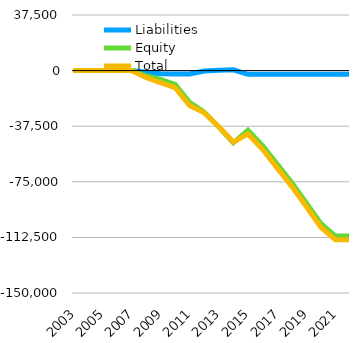
| Category | Liabilities  | Equity  | Total |
|---|---|---|---|
| 2003 | 0 | 0 | 0 |
| 2004 | 0 | 0 | 0 |
| 2005 | 0 | 0 | 0 |
| 2006 | 0 | 0 | 0 |
| 2007 | 0 | 0 | 0 |
| 2008 | -1179 | -3463 | -4642 |
| 2009 | -2174 | -5918 | -8092 |
| 2010 | -2255 | -9271 | -11526 |
| 2011 | -2257 | -21324 | -23581 |
| 2012 | -328 | -28118 | -28446 |
| 2013 | 235 | -38063 | -37828 |
| 2014 | 504 | -48713 | -48209 |
| 2015 | -2525 | -40195 | -42720 |
| 2016 | -2525 | -50547 | -53072 |
| 2017 | -2525 | -63075 | -65600 |
| 2018 | -2525 | -75556 | -78081 |
| 2019 | -2518 | -89189 | -91707 |
| 2020 | -2525.3 | -103124 | -105649.3 |
| 2021 | -2446.3 | -111592 | -114038.3 |
| 2022 | -2497.3 | -111592 | -114089.3 |